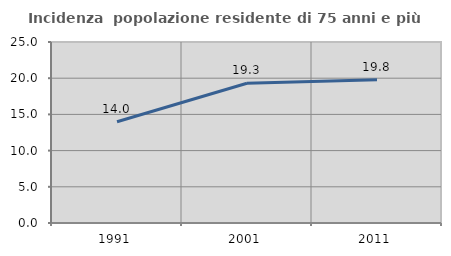
| Category | Incidenza  popolazione residente di 75 anni e più |
|---|---|
| 1991.0 | 13.992 |
| 2001.0 | 19.307 |
| 2011.0 | 19.78 |